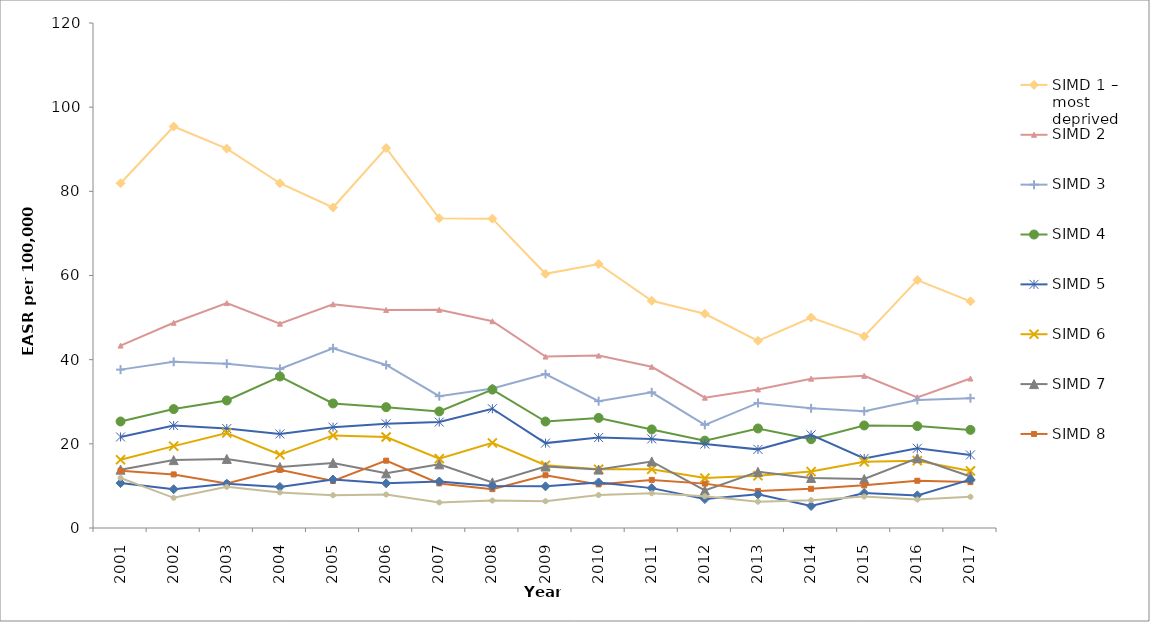
| Category | SIMD 1 – most deprived | SIMD 2 | SIMD 3 | SIMD 4 | SIMD 5 | SIMD 6 | SIMD 7 | SIMD 8 | SIMD 9 | SIMD 10 – least deprived |
|---|---|---|---|---|---|---|---|---|---|---|
| 2001 | 81.91 | 43.342 | 37.633 | 25.313 | 21.639 | 16.22 | 13.865 | 13.622 | 10.667 | 11.892 |
| 2002 | 95.4 | 48.764 | 39.495 | 28.256 | 24.349 | 19.457 | 16.132 | 12.732 | 9.21 | 7.168 |
| 2003 | 90.143 | 53.44 | 39.038 | 30.307 | 23.631 | 22.564 | 16.411 | 10.562 | 10.522 | 9.771 |
| 2004 | 81.929 | 48.564 | 37.806 | 35.996 | 22.343 | 17.443 | 14.49 | 13.813 | 9.762 | 8.46 |
| 2005 | 76.16 | 53.152 | 42.709 | 29.592 | 23.96 | 21.997 | 15.464 | 11.165 | 11.518 | 7.794 |
| 2006 | 90.284 | 51.804 | 38.732 | 28.71 | 24.762 | 21.625 | 12.987 | 16 | 10.608 | 7.957 |
| 2007 | 73.597 | 51.843 | 31.326 | 27.706 | 25.174 | 16.473 | 15.13 | 10.596 | 11.046 | 6.064 |
| 2008 | 73.508 | 49.143 | 33.158 | 32.884 | 28.344 | 20.218 | 10.841 | 9.23 | 9.959 | 6.522 |
| 2009 | 60.402 | 40.737 | 36.569 | 25.306 | 20.175 | 14.9 | 14.6 | 12.536 | 9.905 | 6.362 |
| 2010 | 62.72 | 40.974 | 30.13 | 26.161 | 21.491 | 13.952 | 13.881 | 10.368 | 10.825 | 7.827 |
| 2011 | 53.995 | 38.31 | 32.241 | 23.424 | 21.175 | 13.947 | 15.807 | 11.433 | 9.477 | 8.259 |
| 2012 | 50.902 | 30.963 | 24.509 | 20.758 | 19.944 | 11.866 | 8.935 | 10.545 | 6.875 | 7.545 |
| 2013 | 44.475 | 32.923 | 29.718 | 23.649 | 18.685 | 12.419 | 13.348 | 8.8 | 7.991 | 6.246 |
| 2014 | 50.016 | 35.479 | 28.443 | 21.092 | 22.119 | 13.406 | 11.891 | 9.312 | 5.236 | 6.618 |
| 2015 | 45.534 | 36.155 | 27.749 | 24.365 | 16.535 | 15.729 | 11.64 | 10.133 | 8.317 | 7.47 |
| 2016 | 58.914 | 31.051 | 30.436 | 24.208 | 18.937 | 16.001 | 16.583 | 11.23 | 7.75 | 6.77 |
| 2017 | 53.858 | 35.518 | 30.84 | 23.315 | 17.36 | 13.565 | 12.232 | 10.906 | 11.489 | 7.405 |